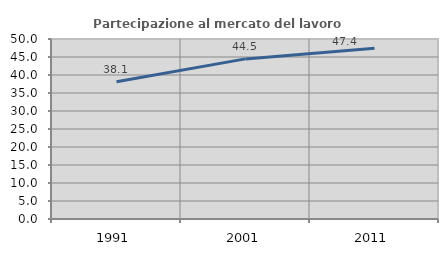
| Category | Partecipazione al mercato del lavoro  femminile |
|---|---|
| 1991.0 | 38.111 |
| 2001.0 | 44.477 |
| 2011.0 | 47.426 |